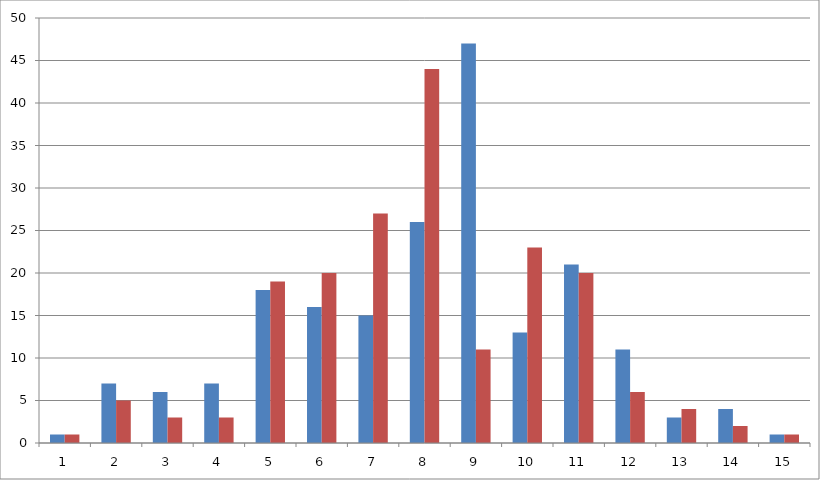
| Category | Series 0 | Series 1 |
|---|---|---|
| 0 | 1 | 1 |
| 1 | 7 | 5 |
| 2 | 6 | 3 |
| 3 | 7 | 3 |
| 4 | 18 | 19 |
| 5 | 16 | 20 |
| 6 | 15 | 27 |
| 7 | 26 | 44 |
| 8 | 47 | 11 |
| 9 | 13 | 23 |
| 10 | 21 | 20 |
| 11 | 11 | 6 |
| 12 | 3 | 4 |
| 13 | 4 | 2 |
| 14 | 1 | 1 |